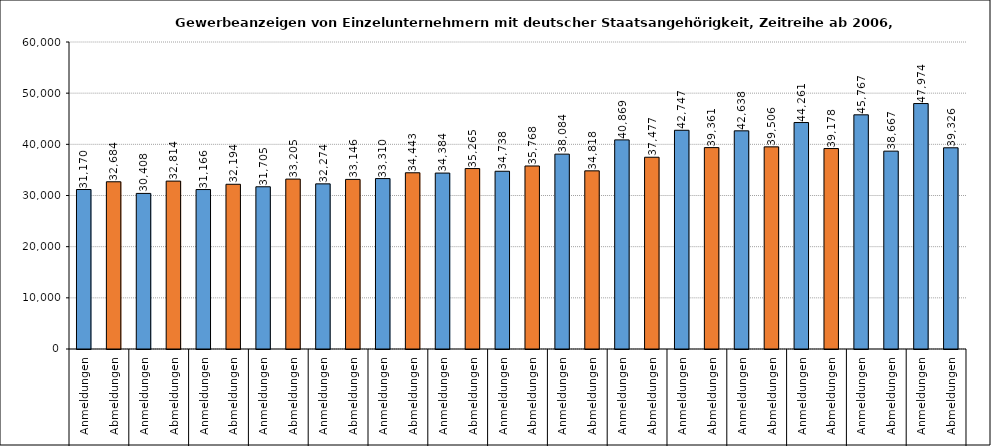
| Category | Series 0 |
|---|---|
| 0 | 31170 |
| 1 | 32684 |
| 2 | 30408 |
| 3 | 32814 |
| 4 | 31166 |
| 5 | 32194 |
| 6 | 31705 |
| 7 | 33205 |
| 8 | 32274 |
| 9 | 33146 |
| 10 | 33310 |
| 11 | 34443 |
| 12 | 34384 |
| 13 | 35265 |
| 14 | 34738 |
| 15 | 35768 |
| 16 | 38084 |
| 17 | 34818 |
| 18 | 40869 |
| 19 | 37477 |
| 20 | 42747 |
| 21 | 39361 |
| 22 | 42638 |
| 23 | 39506 |
| 24 | 44261 |
| 25 | 39178 |
| 26 | 45767 |
| 27 | 38667 |
| 28 | 47974 |
| 29 | 39326 |